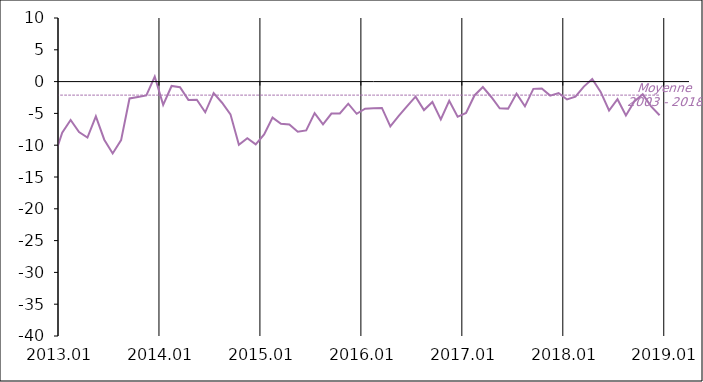
| Category | Series 1 | Moyenne
2003 - 2018 |
|---|---|---|
| 2003-01-20 | 3 | -2.124 |
| 2003-02-20 | 1 | -2.124 |
| 2003-03-20 | 0 | -2.124 |
| 2003-04-20 | 3 | -2.124 |
| 2003-05-20 | 4 | -2.124 |
| 2003-06-20 | 2 | -2.124 |
| 2003-07-20 | 3 | -2.124 |
| 2003-08-20 | 2 | -2.124 |
| 2003-09-20 | 2 | -2.124 |
| 2003-10-20 | 4 | -2.124 |
| 2003-11-20 | 4 | -2.124 |
| 2003-12-20 | 3 | -2.124 |
| 2004-01-20 | 4 | -2.124 |
| 2004-02-20 | 6 | -2.124 |
| 2004-03-20 | 3 | -2.124 |
| 2004-04-20 | 4 | -2.124 |
| 2004-05-20 | 3 | -2.124 |
| 2004-06-20 | 6 | -2.124 |
| 2004-07-20 | 3 | -2.124 |
| 2004-08-20 | 5 | -2.124 |
| 2004-09-20 | 4 | -2.124 |
| 2004-10-20 | 4 | -2.124 |
| 2004-11-20 | 2 | -2.124 |
| 2004-12-20 | 4 | -2.124 |
| 2005-01-20 | 2 | -2.124 |
| 2005-02-20 | 3 | -2.124 |
| 2005-03-20 | 4 | -2.124 |
| 2005-04-20 | 1 | -2.124 |
| 2005-05-20 | 2 | -2.124 |
| 2005-06-20 | 2 | -2.124 |
| 2005-07-20 | 2 | -2.124 |
| 2005-08-20 | -1 | -2.124 |
| 2005-09-20 | -4 | -2.124 |
| 2005-10-20 | -1 | -2.124 |
| 2005-11-20 | 1 | -2.124 |
| 2005-12-20 | 4 | -2.124 |
| 2006-01-20 | 3 | -2.124 |
| 2006-02-20 | 2 | -2.124 |
| 2006-03-20 | 5 | -2.124 |
| 2006-04-20 | 3 | -2.124 |
| 2006-05-20 | 1 | -2.124 |
| 2006-06-20 | 4 | -2.124 |
| 2006-07-20 | 2 | -2.124 |
| 2006-08-20 | 2 | -2.124 |
| 2006-09-20 | 0 | -2.124 |
| 2006-10-20 | 4 | -2.124 |
| 2006-11-20 | 6 | -2.124 |
| 2006-12-20 | 2 | -2.124 |
| 2007-01-20 | 4 | -2.124 |
| 2007-02-20 | 5 | -2.124 |
| 2007-03-20 | 3 | -2.124 |
| 2007-04-20 | 3 | -2.124 |
| 2007-05-20 | 3 | -2.124 |
| 2007-06-20 | 3 | -2.124 |
| 2007-07-20 | 3 | -2.124 |
| 2007-08-20 | 2 | -2.124 |
| 2007-09-20 | 6 | -2.124 |
| 2007-10-20 | 0 | -2.124 |
| 2007-11-20 | -4 | -2.124 |
| 2007-12-20 | -3 | -2.124 |
| 2008-01-20 | -5 | -2.124 |
| 2008-02-20 | -6 | -2.124 |
| 2008-03-20 | -5 | -2.124 |
| 2008-04-20 | -5 | -2.124 |
| 2008-05-20 | -4 | -2.124 |
| 2008-06-20 | -8 | -2.124 |
| 2008-07-20 | -5 | -2.124 |
| 2008-08-20 | -2 | -2.124 |
| 2008-09-20 | -2 | -2.124 |
| 2008-10-20 | -6 | -2.124 |
| 2008-11-20 | -7 | -2.124 |
| 2008-12-20 | -5 | -2.124 |
| 2009-01-20 | -3 | -2.124 |
| 2009-02-20 | -5 | -2.124 |
| 2009-03-20 | -4 | -2.124 |
| 2009-04-20 | -5 | -2.124 |
| 2009-05-20 | -1 | -2.124 |
| 2009-06-20 | -1 | -2.124 |
| 2009-07-20 | -3 | -2.124 |
| 2009-08-20 | -3 | -2.124 |
| 2009-09-20 | -2 | -2.124 |
| 2009-10-20 | -1 | -2.124 |
| 2009-11-20 | 0 | -2.124 |
| 2009-12-20 | -2 | -2.124 |
| 2010-01-20 | -3 | -2.124 |
| 2010-02-20 | -2 | -2.124 |
| 2010-03-20 | 0 | -2.124 |
| 2010-04-20 | 0 | -2.124 |
| 2010-05-20 | -5 | -2.124 |
| 2010-06-20 | 0 | -2.124 |
| 2010-07-20 | -1 | -2.124 |
| 2010-08-20 | -2 | -2.124 |
| 2010-09-20 | 1 | -2.124 |
| 2010-10-20 | -1 | -2.124 |
| 2010-11-20 | 1 | -2.124 |
| 2010-12-20 | -4 | -2.124 |
| 2011-01-20 | -4 | -2.124 |
| 2011-02-20 | -1 | -2.124 |
| 2011-03-20 | -5 | -2.124 |
| 2011-04-20 | -3 | -2.124 |
| 2011-05-20 | -1 | -2.124 |
| 2011-06-20 | -5 | -2.124 |
| 2011-07-20 | -3 | -2.124 |
| 2011-08-20 | -2 | -2.124 |
| 2011-09-20 | -1 | -2.124 |
| 2011-10-20 | -4 | -2.124 |
| 2011-11-20 | -6 | -2.124 |
| 2011-12-20 | -7 | -2.124 |
| 2012-01-20 | -11 | -2.124 |
| 2012-02-20 | -8 | -2.124 |
| 2012-03-20 | -9 | -2.124 |
| 2012-04-20 | -6 | -2.124 |
| 2012-05-20 | -7 | -2.124 |
| 2012-06-20 | -6 | -2.124 |
| 2012-07-20 | -3 | -2.124 |
| 2012-08-20 | -7 | -2.124 |
| 2012-09-20 | -8 | -2.124 |
| 2012-10-20 | -6 | -2.124 |
| 2012-11-20 | -11.159 | -2.124 |
| 2012-12-20 | -12.019 | -2.124 |
| 2013-01-20 | -8.027 | -2.124 |
| 2013-02-20 | -6.036 | -2.124 |
| 2013-03-20 | -7.944 | -2.124 |
| 2013-04-20 | -8.796 | -2.124 |
| 2013-05-20 | -5.46 | -2.124 |
| 2013-06-20 | -9.135 | -2.124 |
| 2013-07-20 | -11.295 | -2.124 |
| 2013-08-20 | -9.198 | -2.124 |
| 2013-09-20 | -2.654 | -2.124 |
| 2013-10-20 | -2.408 | -2.124 |
| 2013-11-20 | -2.171 | -2.124 |
| 2013-12-20 | 0.8 | -2.124 |
| 2014-01-20 | -3.651 | -2.124 |
| 2014-02-20 | -0.688 | -2.124 |
| 2014-03-20 | -0.891 | -2.124 |
| 2014-04-20 | -2.876 | -2.124 |
| 2014-05-20 | -2.85 | -2.124 |
| 2014-06-20 | -4.825 | -2.124 |
| 2014-07-20 | -1.82 | -2.124 |
| 2014-08-20 | -3.325 | -2.124 |
| 2014-09-20 | -5.147 | -2.124 |
| 2014-10-20 | -9.93 | -2.124 |
| 2014-11-20 | -8.903 | -2.124 |
| 2014-12-20 | -9.87 | -2.124 |
| 2015-01-20 | -8.304 | -2.124 |
| 2015-02-20 | -5.658 | -2.124 |
| 2015-03-20 | -6.634 | -2.124 |
| 2015-04-20 | -6.726 | -2.124 |
| 2015-05-20 | -7.878 | -2.124 |
| 2015-06-20 | -7.678 | -2.124 |
| 2015-07-20 | -4.95 | -2.124 |
| 2015-08-20 | -6.732 | -2.124 |
| 2015-09-20 | -5.021 | -2.124 |
| 2015-10-20 | -5.014 | -2.124 |
| 2015-11-20 | -3.473 | -2.124 |
| 2015-12-20 | -5.063 | -2.124 |
| 2016-01-20 | -4.253 | -2.124 |
| 2016-02-20 | -4.198 | -2.124 |
| 2016-03-20 | -4.14 | -2.124 |
| 2016-04-20 | -7.054 | -2.124 |
| 2016-05-20 | -5.4 | -2.124 |
| 2016-06-20 | -3.867 | -2.124 |
| 2016-07-20 | -2.375 | -2.124 |
| 2016-08-20 | -4.479 | -2.124 |
| 2016-09-20 | -3.209 | -2.124 |
| 2016-10-20 | -5.945 | -2.124 |
| 2016-11-20 | -3.017 | -2.124 |
| 2016-12-20 | -5.534 | -2.124 |
| 2017-01-20 | -4.932 | -2.124 |
| 2017-02-20 | -2.179 | -2.124 |
| 2017-03-20 | -0.852 | -2.124 |
| 2017-04-20 | -2.419 | -2.124 |
| 2017-05-20 | -4.188 | -2.124 |
| 2017-06-20 | -4.249 | -2.124 |
| 2017-07-20 | -1.891 | -2.124 |
| 2017-08-20 | -3.891 | -2.124 |
| 2017-09-20 | -1.141 | -2.124 |
| 2017-10-20 | -1.086 | -2.124 |
| 2017-11-20 | -2.199 | -2.124 |
| 2017-12-20 | -1.794 | -2.124 |
| 2018-01-20 | -2.804 | -2.124 |
| 2018-02-20 | -2.357 | -2.124 |
| 2018-03-20 | -0.788 | -2.124 |
| 2018-04-20 | 0.398 | -2.124 |
| 2018-05-20 | -1.623 | -2.124 |
| 2018-06-20 | -4.546 | -2.124 |
| 2018-07-20 | -2.769 | -2.124 |
| 2018-08-20 | -5.337 | -2.124 |
| 2018-09-20 | -3.129 | -2.124 |
| 2018-10-20 | -2.002 | -2.124 |
| 2018-11-20 | -3.89 | -2.124 |
| 2018-12-20 | -5.29 | -2.124 |